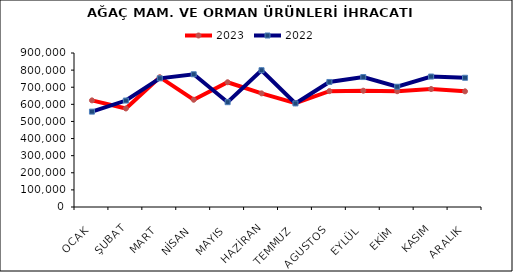
| Category | 2023 | 2022 |
|---|---|---|
| OCAK | 623169.433 | 557400.767 |
| ŞUBAT | 575903.556 | 622156.366 |
| MART | 758555.624 | 751891.702 |
| NİSAN | 626739.514 | 775660.342 |
| MAYIS | 729123.11 | 612460.567 |
| HAZİRAN | 664169.185 | 799352.879 |
| TEMMUZ | 607031.085 | 605383.274 |
| AGUSTOS | 677190.021 | 730779.547 |
| EYLÜL | 679606.496 | 759405.131 |
| EKİM | 676693.583 | 702849.079 |
| KASIM | 689600.101 | 762443.577 |
| ARALIK | 676003.252 | 755251.445 |